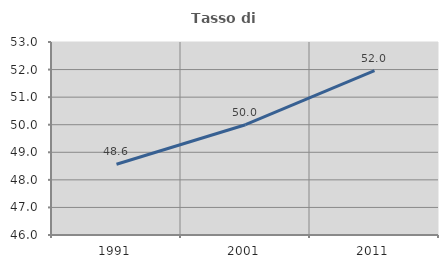
| Category | Tasso di occupazione   |
|---|---|
| 1991.0 | 48.567 |
| 2001.0 | 50 |
| 2011.0 | 51.959 |